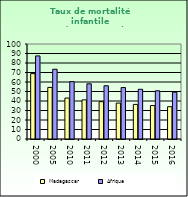
| Category | Madagascar | Afrique                        |
|---|---|---|
| 2000.0 | 68.8 | 87.462 |
| 2005.0 | 54.3 | 73.418 |
| 2010.0 | 43.1 | 60.345 |
| 2011.0 | 41.2 | 58.107 |
| 2012.0 | 39.3 | 56.032 |
| 2013.0 | 37.8 | 54.131 |
| 2014.0 | 36.4 | 52.336 |
| 2015.0 | 35.2 | 50.754 |
| 2016.0 | 34 | 49.283 |